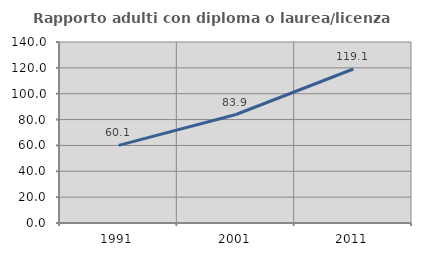
| Category | Rapporto adulti con diploma o laurea/licenza media  |
|---|---|
| 1991.0 | 60.068 |
| 2001.0 | 83.909 |
| 2011.0 | 119.113 |